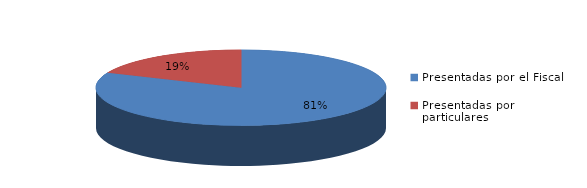
| Category | Series 0 |
|---|---|
| Presentadas por el Fiscal | 180 |
| Presentadas por particulares | 41 |